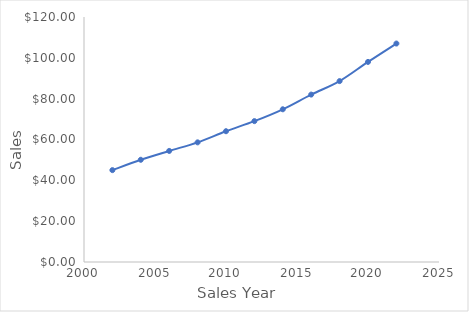
| Category | Series 0 |
|---|---|
| 2002.0 | 45 |
| 2004.0 | 50.07 |
| 2006.0 | 54.4 |
| 2008.0 | 58.6 |
| 2010.0 | 64.05 |
| 2012.0 | 69 |
| 2014.0 | 74.8 |
| 2016.0 | 82 |
| 2018.0 | 88.6 |
| 2020.0 | 98 |
| 2022.0 | 107 |